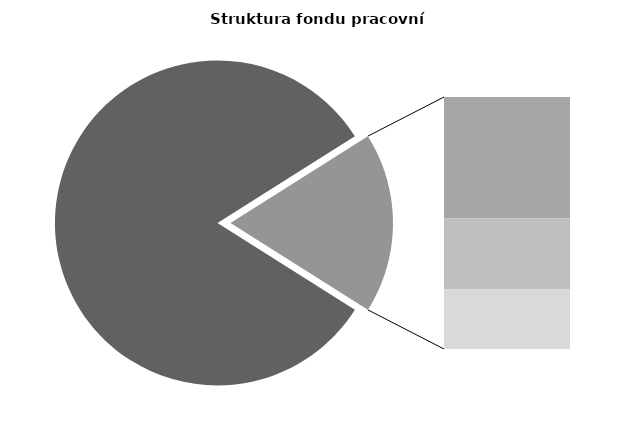
| Category | Series 0 |
|---|---|
| Průměrná měsíční odpracovaná doba bez přesčasu | 138.557 |
| Dovolená | 14.569 |
| Nemoc | 8.583 |
| Jiné | 7.153 |